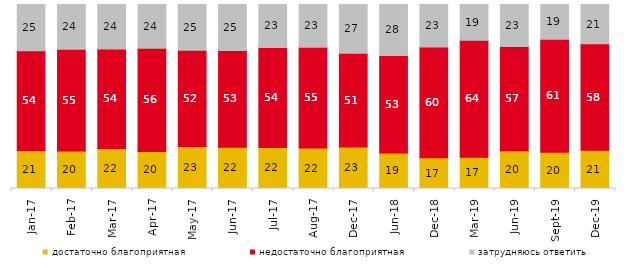
| Category | достаточно благоприятная | недостаточно благоприятная | затрудняюсь ответить |
|---|---|---|---|
| 2017-01-01 | 20.7 | 54.15 | 25.15 |
| 2017-02-01 | 20.4 | 55.3 | 24.3 |
| 2017-03-01 | 21.8 | 54 | 24.2 |
| 2017-04-01 | 20.15 | 56 | 23.75 |
| 2017-05-01 | 22.8 | 52.35 | 24.85 |
| 2017-06-01 | 22.4 | 52.6 | 25 |
| 2017-07-01 | 22.3 | 54.3 | 23.35 |
| 2017-08-01 | 22.05 | 54.65 | 23.3 |
| 2017-12-01 | 22.5 | 51 | 26.5 |
| 2018-06-01 | 19.3 | 53.05 | 27.65 |
| 2018-12-01 | 16.75 | 60.2 | 23.05 |
| 2019-03-01 | 16.957 | 63.55 | 19.493 |
| 2019-06-01 | 20.449 | 56.758 | 22.793 |
| 2019-09-01 | 19.752 | 61.386 | 18.861 |
| 2019-12-01 | 20.743 | 57.871 | 21.386 |